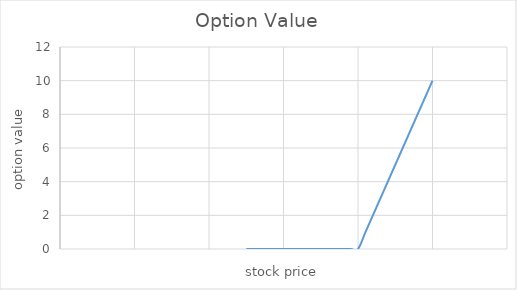
| Category | Option Value |
|---|---|
| 25.0 | 0 |
| 30.0 | 0 |
| 31.0 | 0 |
| 32.0 | 0 |
| 33.0 | 0 |
| 34.0 | 0 |
| 35.0 | 0 |
| 36.0 | 0 |
| 37.0 | 0 |
| 38.0 | 0 |
| 39.0 | 0 |
| 40.0 | 0 |
| 41.0 | 1 |
| 42.0 | 2 |
| 43.0 | 3 |
| 44.0 | 4 |
| 45.0 | 5 |
| 46.0 | 6 |
| 47.0 | 7 |
| 48.0 | 8 |
| 49.0 | 9 |
| 50.0 | 10 |